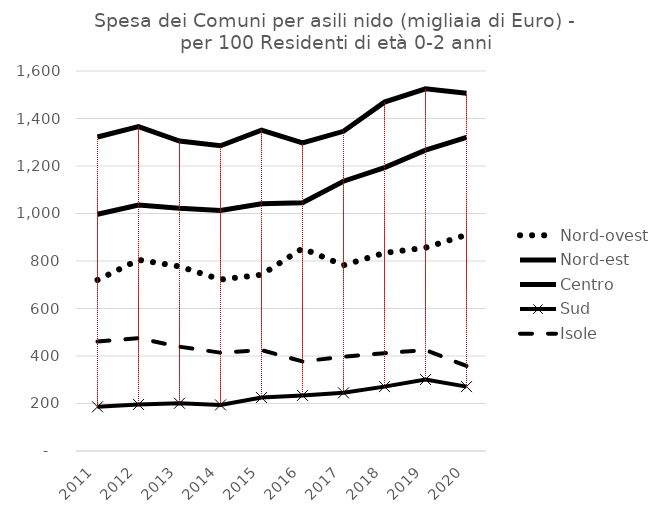
| Category | Nord-ovest | Nord-est | Centro | Sud | Isole |
|---|---|---|---|---|---|
| 2011.0 | 720 | 997 | 1322 | 186 | 461 |
| 2012.0 | 805 | 1036 | 1366 | 196 | 475 |
| 2013.0 | 777 | 1022 | 1305 | 201 | 439 |
| 2014.0 | 722 | 1013 | 1285 | 194 | 414 |
| 2015.0 | 742 | 1041 | 1351 | 225 | 425 |
| 2016.0 | 853 | 1045 | 1297 | 234 | 377 |
| 2017.0 | 782 | 1136 | 1346 | 245 | 397 |
| 2018.0 | 834 | 1193 | 1469 | 271 | 412 |
| 2019.0 | 856 | 1267 | 1525 | 301 | 425 |
| 2020.0 | 910 | 1321 | 1506 | 271 | 358 |